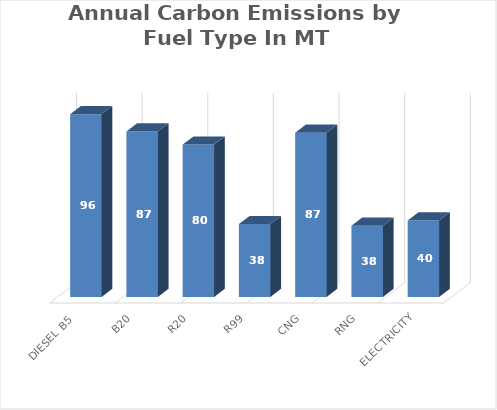
| Category | Series 0 |
|---|---|
| Diesel B5  | 96.307 |
| B20 | 87.268 |
| R20 | 80.333 |
| R99 | 38.391 |
| CNG | 86.556 |
| RNG | 37.533 |
| Electricity | 40.312 |